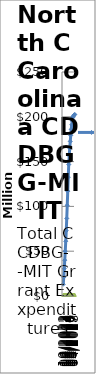
| Category | Projected Expenditures | Actual Expenditure |
|---|---|---|
| 10/2022 | 13120903.358 | 1265968.76 |
| 01/2023 | 21040576.974 | 1332367.64 |
| 04/2023 | 30465080.709 | 1332367.64 |
| 07/2023 | 39930436.771 | 1332367.64 |
| 10/2023 | 50069225.98 | 1332367.64 |
| 01/2023 | 61130688.181 | 1332367.64 |
| 04/2023 | 72799792.374 | 1332367.64 |
| 07/2023 | 86547034.099 | 1332367.64 |
| 10/2023 | 101270629.424 | 1332367.64 |
| 01/2024 | 116993248.574 | 1332367.64 |
| 04/2024 | 132621004.612 | 1332367.64 |
| 07/2024 | 146748760.649 | 1332367.64 |
| 10/2024 | 156627619.047 | 1332367.64 |
| 01/2025 | 165023316.109 | 1332367.64 |
| 04/2025 | 172585231.776 | 1332367.64 |
| 07/2025 | 179277691.887 | 1332367.64 |
| 10/2026 | 185970151.999 | 1332367.64 |
| 01/2027 | 191065386.295 | 1332367.64 |
| 04/2027 | 195560621.592 | 1332367.64 |
| 07/2027 | 199160316.666 | 1332367.64 |
| 10/2027 | 200435301.551 | 1332367.64 |
| 01/2028 | 201560286.436 | 1332367.64 |
| 04/2028 | 202115866.092 | 1332367.64 |
| 07/2028 | 202685999.747 | 1332367.64 |